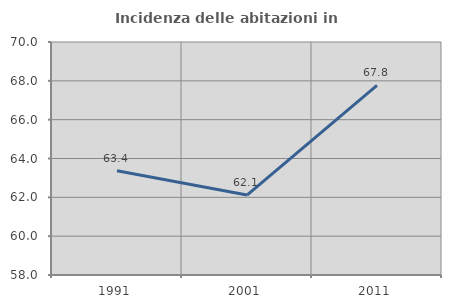
| Category | Incidenza delle abitazioni in proprietà  |
|---|---|
| 1991.0 | 63.372 |
| 2001.0 | 62.118 |
| 2011.0 | 67.767 |